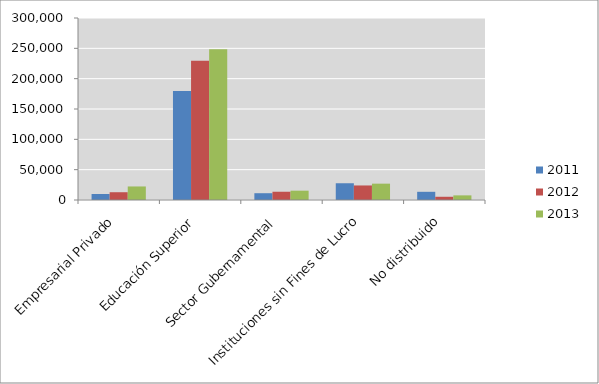
| Category | 2011 | 2012 | 2013 |
|---|---|---|---|
| Empresarial Privado | 9853 | 12814 | 22319 |
| Educación Superior | 179502 | 229694 | 248647 |
| Sector Gubernamental | 11195 | 13608 | 15371 |
| Instituciones sin Fines de Lucro | 27603 | 23958 | 26941 |
| No distribuido | 13509 | 5317 | 7634 |